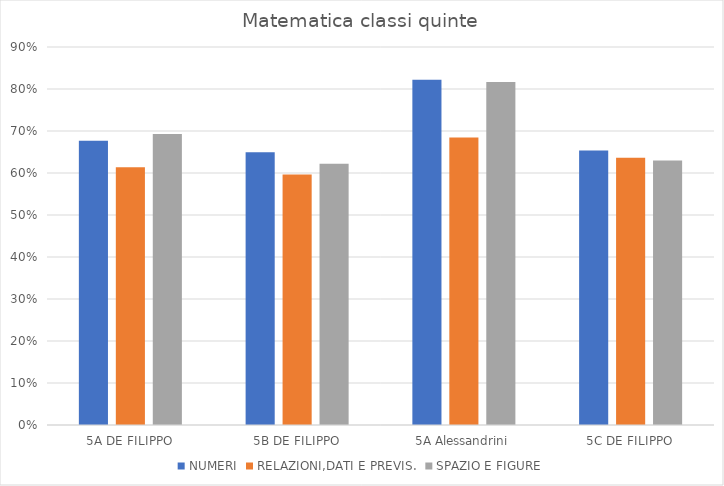
| Category | NUMERI | RELAZIONI,DATI E PREVIS. | SPAZIO E FIGURE |
|---|---|---|---|
| 5A DE FILIPPO | 0.677 | 0.614 | 0.693 |
| 5B DE FILIPPO | 0.649 | 0.597 | 0.622 |
| 5A Alessandrini | 0.822 | 0.685 | 0.817 |
| 5C DE FILIPPO | 0.654 | 0.637 | 0.63 |